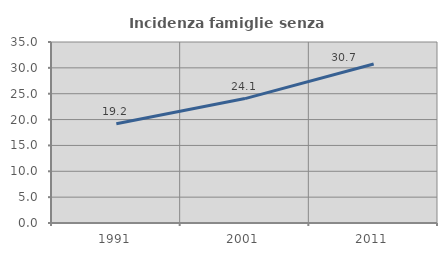
| Category | Incidenza famiglie senza nuclei |
|---|---|
| 1991.0 | 19.208 |
| 2001.0 | 24.056 |
| 2011.0 | 30.739 |